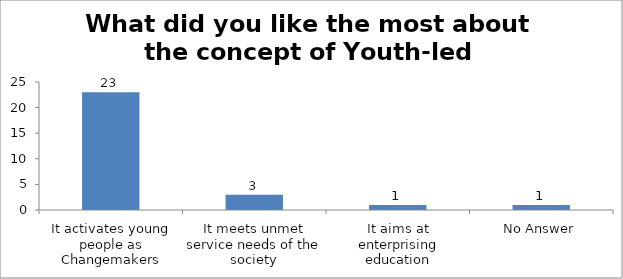
| Category | What did you like the most about the concept of Youth-led Changemaking? |
|---|---|
| It activates young people as Changemakers | 23 |
| It meets unmet service needs of the society | 3 |
| It aims at enterprising education | 1 |
| No Answer | 1 |